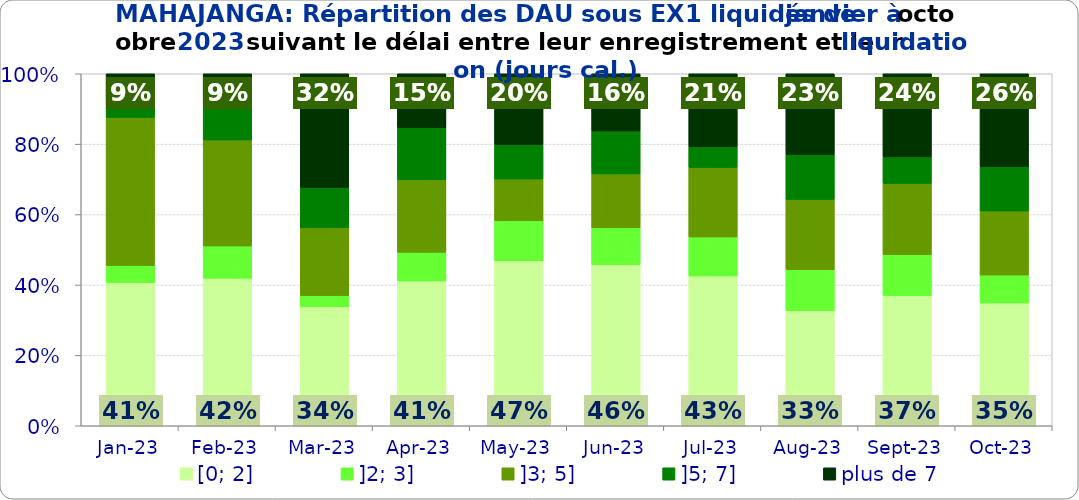
| Category | [0; 2] | ]2; 3] | ]3; 5] | ]5; 7] | plus de 7 |
|---|---|---|---|---|---|
| 2023-01-01 | 0.407 | 0.048 | 0.421 | 0.034 | 0.09 |
| 2023-02-01 | 0.419 | 0.091 | 0.301 | 0.102 | 0.086 |
| 2023-03-01 | 0.339 | 0.031 | 0.193 | 0.115 | 0.323 |
| 2023-04-01 | 0.411 | 0.081 | 0.206 | 0.148 | 0.153 |
| 2023-05-01 | 0.469 | 0.114 | 0.118 | 0.098 | 0.201 |
| 2023-06-01 | 0.458 | 0.105 | 0.153 | 0.122 | 0.163 |
| 2023-07-01 | 0.426 | 0.111 | 0.197 | 0.059 | 0.208 |
| 2023-08-01 | 0.326 | 0.117 | 0.199 | 0.127 | 0.23 |
| 2023-09-01 | 0.37 | 0.116 | 0.202 | 0.075 | 0.236 |
| 2023-10-01 | 0.349 | 0.079 | 0.182 | 0.126 | 0.264 |